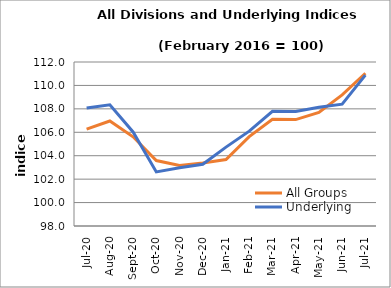
| Category | All Groups | Underlying |
|---|---|---|
| 2020-07-01 | 106.265 | 108.077 |
| 2020-08-01 | 106.963 | 108.349 |
| 2020-09-01 | 105.614 | 106.027 |
| 2020-10-01 | 103.588 | 102.619 |
| 2020-11-01 | 103.171 | 102.969 |
| 2020-12-01 | 103.378 | 103.266 |
| 2021-01-01 | 103.671 | 104.733 |
| 2021-02-01 | 105.627 | 106.099 |
| 2021-03-01 | 107.11 | 107.788 |
| 2021-04-01 | 107.082 | 107.772 |
| 2021-05-01 | 107.693 | 108.128 |
| 2021-06-01 | 109.193 | 108.399 |
| 2021-07-01 | 111.039 | 110.883 |